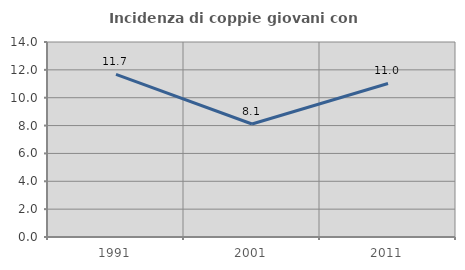
| Category | Incidenza di coppie giovani con figli |
|---|---|
| 1991.0 | 11.677 |
| 2001.0 | 8.114 |
| 2011.0 | 11.025 |